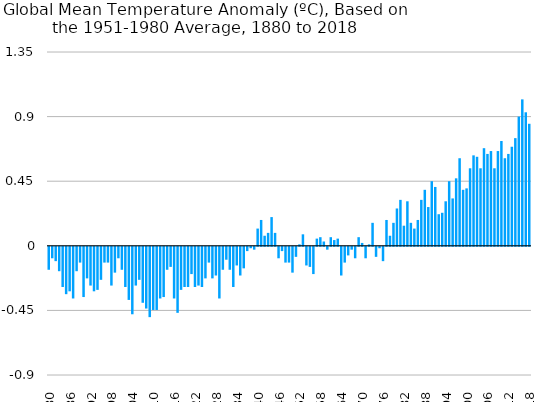
| Category | Average |
|---|---|
| 1880 | -0.16 |
| 1881 | -0.08 |
| 1882 | -0.1 |
| 1883 | -0.17 |
| 1884 | -0.28 |
| 1885 | -0.33 |
| 1886 | -0.31 |
| 1887 | -0.36 |
| 1888 | -0.17 |
| 1889 | -0.11 |
| 1890 | -0.35 |
| 1891 | -0.22 |
| 1892 | -0.27 |
| 1893 | -0.31 |
| 1894 | -0.3 |
| 1895 | -0.23 |
| 1896 | -0.11 |
| 1897 | -0.11 |
| 1898 | -0.27 |
| 1899 | -0.18 |
| 1900 | -0.08 |
| 1901 | -0.16 |
| 1902 | -0.28 |
| 1903 | -0.37 |
| 1904 | -0.47 |
| 1905 | -0.27 |
| 1906 | -0.23 |
| 1907 | -0.39 |
| 1908 | -0.43 |
| 1909 | -0.49 |
| 1910 | -0.44 |
| 1911 | -0.44 |
| 1912 | -0.36 |
| 1913 | -0.35 |
| 1914 | -0.16 |
| 1915 | -0.14 |
| 1916 | -0.36 |
| 1917 | -0.46 |
| 1918 | -0.3 |
| 1919 | -0.28 |
| 1920 | -0.28 |
| 1921 | -0.19 |
| 1922 | -0.28 |
| 1923 | -0.27 |
| 1924 | -0.28 |
| 1925 | -0.22 |
| 1926 | -0.11 |
| 1927 | -0.22 |
| 1928 | -0.2 |
| 1929 | -0.36 |
| 1930 | -0.16 |
| 1931 | -0.09 |
| 1932 | -0.16 |
| 1933 | -0.28 |
| 1934 | -0.13 |
| 1935 | -0.2 |
| 1936 | -0.15 |
| 1937 | -0.03 |
| 1938 | -0.01 |
| 1939 | -0.02 |
| 1940 | 0.12 |
| 1941 | 0.18 |
| 1942 | 0.07 |
| 1943 | 0.09 |
| 1944 | 0.2 |
| 1945 | 0.09 |
| 1946 | -0.08 |
| 1947 | -0.03 |
| 1948 | -0.11 |
| 1949 | -0.11 |
| 1950 | -0.18 |
| 1951 | -0.07 |
| 1952 | 0.01 |
| 1953 | 0.08 |
| 1954 | -0.13 |
| 1955 | -0.14 |
| 1956 | -0.19 |
| 1957 | 0.05 |
| 1958 | 0.06 |
| 1959 | 0.03 |
| 1960 | -0.02 |
| 1961 | 0.06 |
| 1962 | 0.04 |
| 1963 | 0.05 |
| 1964 | -0.2 |
| 1965 | -0.11 |
| 1966 | -0.06 |
| 1967 | -0.02 |
| 1968 | -0.08 |
| 1969 | 0.06 |
| 1970 | 0.02 |
| 1971 | -0.08 |
| 1972 | 0.01 |
| 1973 | 0.16 |
| 1974 | -0.07 |
| 1975 | -0.01 |
| 1976 | -0.1 |
| 1977 | 0.18 |
| 1978 | 0.07 |
| 1979 | 0.16 |
| 1980 | 0.26 |
| 1981 | 0.32 |
| 1982 | 0.14 |
| 1983 | 0.31 |
| 1984 | 0.16 |
| 1985 | 0.12 |
| 1986 | 0.18 |
| 1987 | 0.32 |
| 1988 | 0.39 |
| 1989 | 0.27 |
| 1990 | 0.45 |
| 1991 | 0.41 |
| 1992 | 0.22 |
| 1993 | 0.23 |
| 1994 | 0.31 |
| 1995 | 0.45 |
| 1996 | 0.33 |
| 1997 | 0.47 |
| 1998 | 0.61 |
| 1999 | 0.39 |
| 2000 | 0.4 |
| 2001 | 0.54 |
| 2002 | 0.63 |
| 2003 | 0.62 |
| 2004 | 0.54 |
| 2005 | 0.68 |
| 2006 | 0.64 |
| 2007 | 0.66 |
| 2008 | 0.54 |
| 2009 | 0.66 |
| 2010 | 0.73 |
| 2011 | 0.61 |
| 2012 | 0.64 |
| 2013 | 0.69 |
| 2014 | 0.75 |
| 2015 | 0.9 |
| 2016 | 1.02 |
| 2017 | 0.93 |
| 2018 | 0.85 |